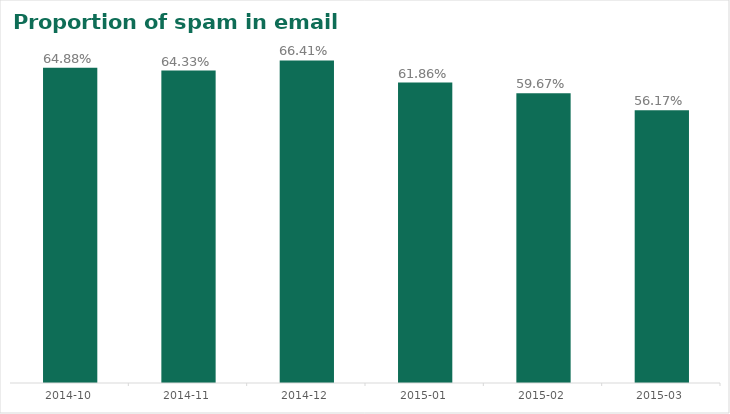
| Category | percent |
|---|---|
| 2014-10-01 | 0.649 |
| 2014-11-01 | 0.643 |
| 2014-12-01 | 0.664 |
| 2015-01-01 | 0.619 |
| 2015-02-01 | 0.597 |
| 2015-03-01 | 0.562 |